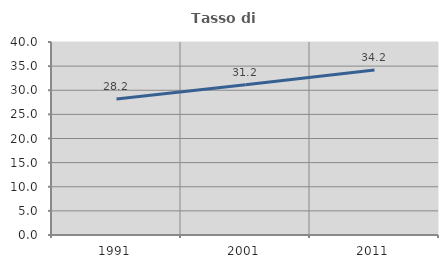
| Category | Tasso di occupazione   |
|---|---|
| 1991.0 | 28.2 |
| 2001.0 | 31.156 |
| 2011.0 | 34.205 |